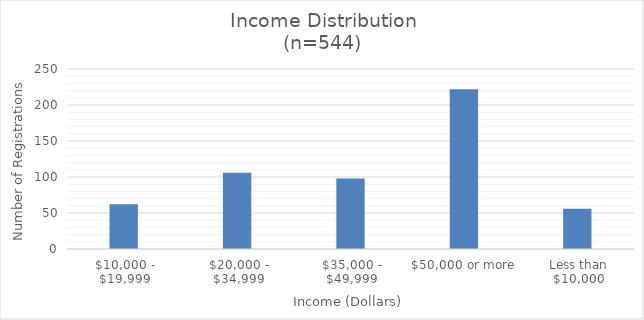
| Category | Series 0 |
|---|---|
| $10,000 - $19,999 | 62 |
| $20,000 - $34,999 | 106 |
| $35,000 - $49,999 | 98 |
| $50,000 or more | 222 |
| Less than $10,000 | 56 |